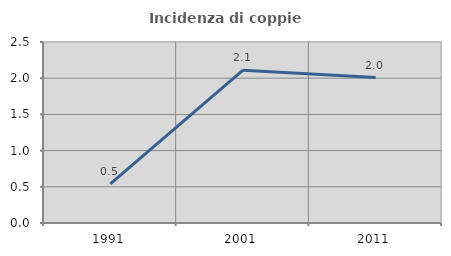
| Category | Incidenza di coppie miste |
|---|---|
| 1991.0 | 0.539 |
| 2001.0 | 2.111 |
| 2011.0 | 2.009 |